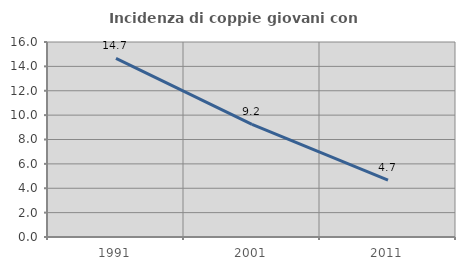
| Category | Incidenza di coppie giovani con figli |
|---|---|
| 1991.0 | 14.657 |
| 2001.0 | 9.244 |
| 2011.0 | 4.658 |